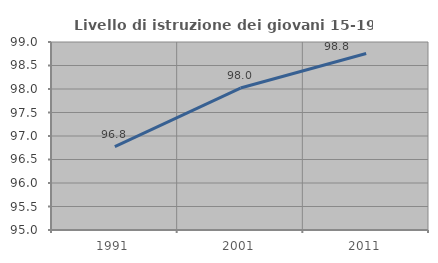
| Category | Livello di istruzione dei giovani 15-19 anni |
|---|---|
| 1991.0 | 96.774 |
| 2001.0 | 98.02 |
| 2011.0 | 98.757 |